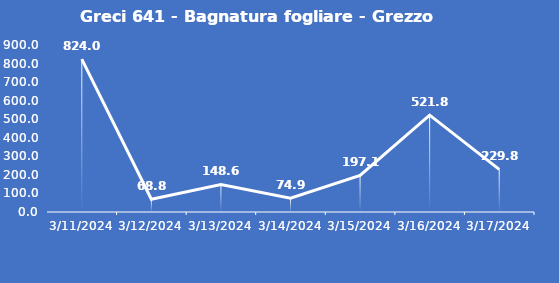
| Category | Greci 641 - Bagnatura fogliare - Grezzo (min) |
|---|---|
| 3/11/24 | 824 |
| 3/12/24 | 68.8 |
| 3/13/24 | 148.6 |
| 3/14/24 | 74.9 |
| 3/15/24 | 197.1 |
| 3/16/24 | 521.8 |
| 3/17/24 | 229.8 |